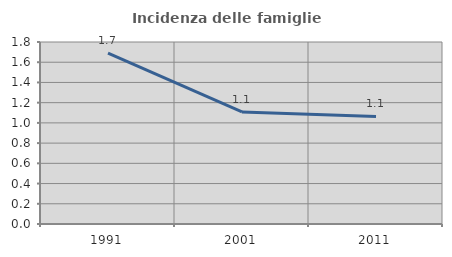
| Category | Incidenza delle famiglie numerose |
|---|---|
| 1991.0 | 1.69 |
| 2001.0 | 1.109 |
| 2011.0 | 1.064 |